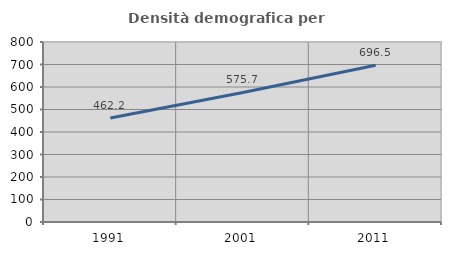
| Category | Densità demografica |
|---|---|
| 1991.0 | 462.151 |
| 2001.0 | 575.663 |
| 2011.0 | 696.477 |